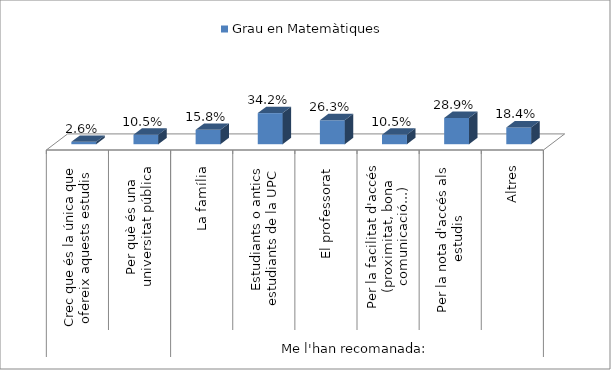
| Category | Grau en Matemàtiques |
|---|---|
| 0 | 0.026 |
| 1 | 0.105 |
| 2 | 0.158 |
| 3 | 0.342 |
| 4 | 0.263 |
| 5 | 0.105 |
| 6 | 0.289 |
| 7 | 0.184 |